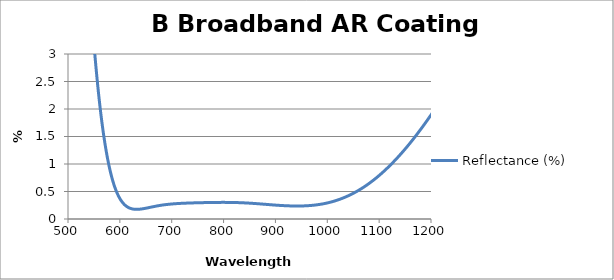
| Category | Reflectance (%) |
|---|---|
| 500.0 | 12.191 |
| 501.0 | 11.975 |
| 502.0 | 11.758 |
| 503.0 | 11.541 |
| 504.0 | 11.323 |
| 505.0 | 11.106 |
| 506.0 | 10.888 |
| 507.0 | 10.671 |
| 508.0 | 10.454 |
| 509.0 | 10.238 |
| 510.0 | 10.023 |
| 511.0 | 9.809 |
| 512.0 | 9.596 |
| 513.0 | 9.384 |
| 514.0 | 9.174 |
| 515.0 | 8.965 |
| 516.0 | 8.758 |
| 517.0 | 8.552 |
| 518.0 | 8.349 |
| 519.0 | 8.147 |
| 520.0 | 7.947 |
| 521.0 | 7.749 |
| 522.0 | 7.553 |
| 523.0 | 7.36 |
| 524.0 | 7.169 |
| 525.0 | 6.98 |
| 526.0 | 6.794 |
| 527.0 | 6.611 |
| 528.0 | 6.43 |
| 529.0 | 6.252 |
| 530.0 | 6.077 |
| 531.0 | 5.904 |
| 532.0 | 5.735 |
| 533.0 | 5.568 |
| 534.0 | 5.403 |
| 535.0 | 5.242 |
| 536.0 | 5.084 |
| 537.0 | 4.928 |
| 538.0 | 4.776 |
| 539.0 | 4.628 |
| 540.0 | 4.482 |
| 541.0 | 4.339 |
| 542.0 | 4.199 |
| 543.0 | 4.062 |
| 544.0 | 3.928 |
| 545.0 | 3.797 |
| 546.0 | 3.669 |
| 547.0 | 3.544 |
| 548.0 | 3.422 |
| 549.0 | 3.303 |
| 550.0 | 3.187 |
| 551.0 | 3.074 |
| 552.0 | 2.964 |
| 553.0 | 2.858 |
| 554.0 | 2.753 |
| 555.0 | 2.652 |
| 556.0 | 2.554 |
| 557.0 | 2.458 |
| 558.0 | 2.365 |
| 559.0 | 2.274 |
| 560.0 | 2.187 |
| 561.0 | 2.102 |
| 562.0 | 2.019 |
| 563.0 | 1.939 |
| 564.0 | 1.862 |
| 565.0 | 1.787 |
| 566.0 | 1.715 |
| 567.0 | 1.645 |
| 568.0 | 1.577 |
| 569.0 | 1.512 |
| 570.0 | 1.448 |
| 571.0 | 1.387 |
| 572.0 | 1.328 |
| 573.0 | 1.272 |
| 574.0 | 1.217 |
| 575.0 | 1.164 |
| 576.0 | 1.114 |
| 577.0 | 1.065 |
| 578.0 | 1.018 |
| 579.0 | 0.973 |
| 580.0 | 0.93 |
| 581.0 | 0.888 |
| 582.0 | 0.849 |
| 583.0 | 0.81 |
| 584.0 | 0.774 |
| 585.0 | 0.739 |
| 586.0 | 0.705 |
| 587.0 | 0.673 |
| 588.0 | 0.643 |
| 589.0 | 0.614 |
| 590.0 | 0.586 |
| 591.0 | 0.559 |
| 592.0 | 0.534 |
| 593.0 | 0.51 |
| 594.0 | 0.487 |
| 595.0 | 0.465 |
| 596.0 | 0.444 |
| 597.0 | 0.425 |
| 598.0 | 0.406 |
| 599.0 | 0.389 |
| 600.0 | 0.372 |
| 601.0 | 0.356 |
| 602.0 | 0.342 |
| 603.0 | 0.328 |
| 604.0 | 0.315 |
| 605.0 | 0.302 |
| 606.0 | 0.291 |
| 607.0 | 0.28 |
| 608.0 | 0.27 |
| 609.0 | 0.261 |
| 610.0 | 0.252 |
| 611.0 | 0.244 |
| 612.0 | 0.236 |
| 613.0 | 0.229 |
| 614.0 | 0.223 |
| 615.0 | 0.217 |
| 616.0 | 0.211 |
| 617.0 | 0.206 |
| 618.0 | 0.202 |
| 619.0 | 0.198 |
| 620.0 | 0.194 |
| 621.0 | 0.191 |
| 622.0 | 0.188 |
| 623.0 | 0.186 |
| 624.0 | 0.183 |
| 625.0 | 0.182 |
| 626.0 | 0.18 |
| 627.0 | 0.179 |
| 628.0 | 0.178 |
| 629.0 | 0.177 |
| 630.0 | 0.176 |
| 631.0 | 0.176 |
| 632.0 | 0.176 |
| 633.0 | 0.176 |
| 634.0 | 0.176 |
| 635.0 | 0.176 |
| 636.0 | 0.177 |
| 637.0 | 0.178 |
| 638.0 | 0.178 |
| 639.0 | 0.179 |
| 640.0 | 0.18 |
| 641.0 | 0.182 |
| 642.0 | 0.183 |
| 643.0 | 0.184 |
| 644.0 | 0.186 |
| 645.0 | 0.187 |
| 646.0 | 0.189 |
| 647.0 | 0.19 |
| 648.0 | 0.192 |
| 649.0 | 0.194 |
| 650.0 | 0.196 |
| 651.0 | 0.198 |
| 652.0 | 0.2 |
| 653.0 | 0.202 |
| 654.0 | 0.203 |
| 655.0 | 0.205 |
| 656.0 | 0.207 |
| 657.0 | 0.209 |
| 658.0 | 0.211 |
| 659.0 | 0.213 |
| 660.0 | 0.215 |
| 661.0 | 0.217 |
| 662.0 | 0.219 |
| 663.0 | 0.221 |
| 664.0 | 0.223 |
| 665.0 | 0.225 |
| 666.0 | 0.227 |
| 667.0 | 0.229 |
| 668.0 | 0.231 |
| 669.0 | 0.232 |
| 670.0 | 0.234 |
| 671.0 | 0.236 |
| 672.0 | 0.238 |
| 673.0 | 0.24 |
| 674.0 | 0.241 |
| 675.0 | 0.243 |
| 676.0 | 0.244 |
| 677.0 | 0.246 |
| 678.0 | 0.248 |
| 679.0 | 0.249 |
| 680.0 | 0.25 |
| 681.0 | 0.252 |
| 682.0 | 0.253 |
| 683.0 | 0.255 |
| 684.0 | 0.256 |
| 685.0 | 0.257 |
| 686.0 | 0.258 |
| 687.0 | 0.26 |
| 688.0 | 0.261 |
| 689.0 | 0.262 |
| 690.0 | 0.263 |
| 691.0 | 0.264 |
| 692.0 | 0.265 |
| 693.0 | 0.266 |
| 694.0 | 0.267 |
| 695.0 | 0.268 |
| 696.0 | 0.269 |
| 697.0 | 0.27 |
| 698.0 | 0.271 |
| 699.0 | 0.272 |
| 700.0 | 0.273 |
| 701.0 | 0.274 |
| 702.0 | 0.274 |
| 703.0 | 0.275 |
| 704.0 | 0.276 |
| 705.0 | 0.277 |
| 706.0 | 0.277 |
| 707.0 | 0.278 |
| 708.0 | 0.279 |
| 709.0 | 0.279 |
| 710.0 | 0.28 |
| 711.0 | 0.281 |
| 712.0 | 0.281 |
| 713.0 | 0.282 |
| 714.0 | 0.282 |
| 715.0 | 0.283 |
| 716.0 | 0.283 |
| 717.0 | 0.284 |
| 718.0 | 0.284 |
| 719.0 | 0.285 |
| 720.0 | 0.285 |
| 721.0 | 0.286 |
| 722.0 | 0.286 |
| 723.0 | 0.286 |
| 724.0 | 0.287 |
| 725.0 | 0.287 |
| 726.0 | 0.288 |
| 727.0 | 0.288 |
| 728.0 | 0.288 |
| 729.0 | 0.289 |
| 730.0 | 0.289 |
| 731.0 | 0.29 |
| 732.0 | 0.29 |
| 733.0 | 0.29 |
| 734.0 | 0.291 |
| 735.0 | 0.291 |
| 736.0 | 0.291 |
| 737.0 | 0.292 |
| 738.0 | 0.292 |
| 739.0 | 0.292 |
| 740.0 | 0.292 |
| 741.0 | 0.293 |
| 742.0 | 0.293 |
| 743.0 | 0.293 |
| 744.0 | 0.294 |
| 745.0 | 0.294 |
| 746.0 | 0.294 |
| 747.0 | 0.294 |
| 748.0 | 0.295 |
| 749.0 | 0.295 |
| 750.0 | 0.295 |
| 751.0 | 0.296 |
| 752.0 | 0.296 |
| 753.0 | 0.296 |
| 754.0 | 0.296 |
| 755.0 | 0.296 |
| 756.0 | 0.297 |
| 757.0 | 0.297 |
| 758.0 | 0.297 |
| 759.0 | 0.297 |
| 760.0 | 0.297 |
| 761.0 | 0.298 |
| 762.0 | 0.298 |
| 763.0 | 0.298 |
| 764.0 | 0.298 |
| 765.0 | 0.298 |
| 766.0 | 0.299 |
| 767.0 | 0.299 |
| 768.0 | 0.299 |
| 769.0 | 0.299 |
| 770.0 | 0.299 |
| 771.0 | 0.3 |
| 772.0 | 0.3 |
| 773.0 | 0.3 |
| 774.0 | 0.3 |
| 775.0 | 0.3 |
| 776.0 | 0.3 |
| 777.0 | 0.3 |
| 778.0 | 0.301 |
| 779.0 | 0.301 |
| 780.0 | 0.301 |
| 781.0 | 0.301 |
| 782.0 | 0.301 |
| 783.0 | 0.301 |
| 784.0 | 0.301 |
| 785.0 | 0.302 |
| 786.0 | 0.302 |
| 787.0 | 0.302 |
| 788.0 | 0.302 |
| 789.0 | 0.302 |
| 790.0 | 0.302 |
| 791.0 | 0.302 |
| 792.0 | 0.302 |
| 793.0 | 0.302 |
| 794.0 | 0.302 |
| 795.0 | 0.302 |
| 796.0 | 0.302 |
| 797.0 | 0.302 |
| 798.0 | 0.302 |
| 799.0 | 0.302 |
| 800.0 | 0.302 |
| 801.0 | 0.302 |
| 802.0 | 0.302 |
| 803.0 | 0.302 |
| 804.0 | 0.302 |
| 805.0 | 0.302 |
| 806.0 | 0.302 |
| 807.0 | 0.302 |
| 808.0 | 0.302 |
| 809.0 | 0.302 |
| 810.0 | 0.302 |
| 811.0 | 0.302 |
| 812.0 | 0.302 |
| 813.0 | 0.301 |
| 814.0 | 0.301 |
| 815.0 | 0.301 |
| 816.0 | 0.301 |
| 817.0 | 0.301 |
| 818.0 | 0.3 |
| 819.0 | 0.3 |
| 820.0 | 0.3 |
| 821.0 | 0.3 |
| 822.0 | 0.3 |
| 823.0 | 0.299 |
| 824.0 | 0.299 |
| 825.0 | 0.299 |
| 826.0 | 0.298 |
| 827.0 | 0.298 |
| 828.0 | 0.298 |
| 829.0 | 0.298 |
| 830.0 | 0.297 |
| 831.0 | 0.297 |
| 832.0 | 0.296 |
| 833.0 | 0.296 |
| 834.0 | 0.296 |
| 835.0 | 0.295 |
| 836.0 | 0.295 |
| 837.0 | 0.295 |
| 838.0 | 0.294 |
| 839.0 | 0.294 |
| 840.0 | 0.293 |
| 841.0 | 0.293 |
| 842.0 | 0.292 |
| 843.0 | 0.292 |
| 844.0 | 0.291 |
| 845.0 | 0.291 |
| 846.0 | 0.29 |
| 847.0 | 0.29 |
| 848.0 | 0.289 |
| 849.0 | 0.289 |
| 850.0 | 0.288 |
| 851.0 | 0.288 |
| 852.0 | 0.287 |
| 853.0 | 0.286 |
| 854.0 | 0.286 |
| 855.0 | 0.285 |
| 856.0 | 0.284 |
| 857.0 | 0.284 |
| 858.0 | 0.283 |
| 859.0 | 0.282 |
| 860.0 | 0.282 |
| 861.0 | 0.281 |
| 862.0 | 0.28 |
| 863.0 | 0.28 |
| 864.0 | 0.279 |
| 865.0 | 0.278 |
| 866.0 | 0.278 |
| 867.0 | 0.277 |
| 868.0 | 0.276 |
| 869.0 | 0.276 |
| 870.0 | 0.275 |
| 871.0 | 0.274 |
| 872.0 | 0.273 |
| 873.0 | 0.273 |
| 874.0 | 0.272 |
| 875.0 | 0.271 |
| 876.0 | 0.27 |
| 877.0 | 0.27 |
| 878.0 | 0.269 |
| 879.0 | 0.268 |
| 880.0 | 0.267 |
| 881.0 | 0.267 |
| 882.0 | 0.266 |
| 883.0 | 0.265 |
| 884.0 | 0.264 |
| 885.0 | 0.264 |
| 886.0 | 0.263 |
| 887.0 | 0.262 |
| 888.0 | 0.261 |
| 889.0 | 0.261 |
| 890.0 | 0.26 |
| 891.0 | 0.259 |
| 892.0 | 0.258 |
| 893.0 | 0.258 |
| 894.0 | 0.257 |
| 895.0 | 0.256 |
| 896.0 | 0.255 |
| 897.0 | 0.255 |
| 898.0 | 0.254 |
| 899.0 | 0.253 |
| 900.0 | 0.252 |
| 901.0 | 0.252 |
| 902.0 | 0.251 |
| 903.0 | 0.25 |
| 904.0 | 0.25 |
| 905.0 | 0.249 |
| 906.0 | 0.249 |
| 907.0 | 0.248 |
| 908.0 | 0.248 |
| 909.0 | 0.247 |
| 910.0 | 0.246 |
| 911.0 | 0.246 |
| 912.0 | 0.245 |
| 913.0 | 0.245 |
| 914.0 | 0.244 |
| 915.0 | 0.244 |
| 916.0 | 0.243 |
| 917.0 | 0.243 |
| 918.0 | 0.242 |
| 919.0 | 0.242 |
| 920.0 | 0.241 |
| 921.0 | 0.241 |
| 922.0 | 0.24 |
| 923.0 | 0.24 |
| 924.0 | 0.24 |
| 925.0 | 0.239 |
| 926.0 | 0.239 |
| 927.0 | 0.239 |
| 928.0 | 0.238 |
| 929.0 | 0.238 |
| 930.0 | 0.238 |
| 931.0 | 0.238 |
| 932.0 | 0.237 |
| 933.0 | 0.237 |
| 934.0 | 0.237 |
| 935.0 | 0.237 |
| 936.0 | 0.237 |
| 937.0 | 0.236 |
| 938.0 | 0.236 |
| 939.0 | 0.236 |
| 940.0 | 0.236 |
| 941.0 | 0.236 |
| 942.0 | 0.236 |
| 943.0 | 0.236 |
| 944.0 | 0.236 |
| 945.0 | 0.236 |
| 946.0 | 0.236 |
| 947.0 | 0.236 |
| 948.0 | 0.237 |
| 949.0 | 0.237 |
| 950.0 | 0.237 |
| 951.0 | 0.237 |
| 952.0 | 0.238 |
| 953.0 | 0.238 |
| 954.0 | 0.238 |
| 955.0 | 0.238 |
| 956.0 | 0.239 |
| 957.0 | 0.239 |
| 958.0 | 0.24 |
| 959.0 | 0.24 |
| 960.0 | 0.241 |
| 961.0 | 0.241 |
| 962.0 | 0.242 |
| 963.0 | 0.242 |
| 964.0 | 0.243 |
| 965.0 | 0.244 |
| 966.0 | 0.244 |
| 967.0 | 0.245 |
| 968.0 | 0.246 |
| 969.0 | 0.247 |
| 970.0 | 0.248 |
| 971.0 | 0.248 |
| 972.0 | 0.249 |
| 973.0 | 0.25 |
| 974.0 | 0.251 |
| 975.0 | 0.252 |
| 976.0 | 0.253 |
| 977.0 | 0.254 |
| 978.0 | 0.256 |
| 979.0 | 0.257 |
| 980.0 | 0.258 |
| 981.0 | 0.259 |
| 982.0 | 0.261 |
| 983.0 | 0.262 |
| 984.0 | 0.263 |
| 985.0 | 0.265 |
| 986.0 | 0.266 |
| 987.0 | 0.268 |
| 988.0 | 0.269 |
| 989.0 | 0.271 |
| 990.0 | 0.273 |
| 991.0 | 0.274 |
| 992.0 | 0.276 |
| 993.0 | 0.278 |
| 994.0 | 0.28 |
| 995.0 | 0.282 |
| 996.0 | 0.284 |
| 997.0 | 0.286 |
| 998.0 | 0.288 |
| 999.0 | 0.29 |
| 1000.0 | 0.292 |
| 1001.0 | 0.294 |
| 1002.0 | 0.296 |
| 1003.0 | 0.299 |
| 1004.0 | 0.301 |
| 1005.0 | 0.303 |
| 1006.0 | 0.306 |
| 1007.0 | 0.308 |
| 1008.0 | 0.311 |
| 1009.0 | 0.313 |
| 1010.0 | 0.316 |
| 1011.0 | 0.319 |
| 1012.0 | 0.321 |
| 1013.0 | 0.324 |
| 1014.0 | 0.327 |
| 1015.0 | 0.33 |
| 1016.0 | 0.333 |
| 1017.0 | 0.336 |
| 1018.0 | 0.339 |
| 1019.0 | 0.342 |
| 1020.0 | 0.345 |
| 1021.0 | 0.348 |
| 1022.0 | 0.352 |
| 1023.0 | 0.355 |
| 1024.0 | 0.358 |
| 1025.0 | 0.362 |
| 1026.0 | 0.365 |
| 1027.0 | 0.369 |
| 1028.0 | 0.372 |
| 1029.0 | 0.376 |
| 1030.0 | 0.38 |
| 1031.0 | 0.384 |
| 1032.0 | 0.388 |
| 1033.0 | 0.391 |
| 1034.0 | 0.395 |
| 1035.0 | 0.399 |
| 1036.0 | 0.404 |
| 1037.0 | 0.408 |
| 1038.0 | 0.412 |
| 1039.0 | 0.416 |
| 1040.0 | 0.42 |
| 1041.0 | 0.425 |
| 1042.0 | 0.429 |
| 1043.0 | 0.434 |
| 1044.0 | 0.438 |
| 1045.0 | 0.443 |
| 1046.0 | 0.447 |
| 1047.0 | 0.452 |
| 1048.0 | 0.457 |
| 1049.0 | 0.462 |
| 1050.0 | 0.467 |
| 1051.0 | 0.472 |
| 1052.0 | 0.477 |
| 1053.0 | 0.482 |
| 1054.0 | 0.487 |
| 1055.0 | 0.492 |
| 1056.0 | 0.497 |
| 1057.0 | 0.503 |
| 1058.0 | 0.508 |
| 1059.0 | 0.514 |
| 1060.0 | 0.519 |
| 1061.0 | 0.525 |
| 1062.0 | 0.53 |
| 1063.0 | 0.536 |
| 1064.0 | 0.542 |
| 1065.0 | 0.548 |
| 1066.0 | 0.553 |
| 1067.0 | 0.559 |
| 1068.0 | 0.565 |
| 1069.0 | 0.572 |
| 1070.0 | 0.578 |
| 1071.0 | 0.584 |
| 1072.0 | 0.59 |
| 1073.0 | 0.596 |
| 1074.0 | 0.603 |
| 1075.0 | 0.609 |
| 1076.0 | 0.616 |
| 1077.0 | 0.622 |
| 1078.0 | 0.629 |
| 1079.0 | 0.636 |
| 1080.0 | 0.642 |
| 1081.0 | 0.649 |
| 1082.0 | 0.656 |
| 1083.0 | 0.663 |
| 1084.0 | 0.67 |
| 1085.0 | 0.677 |
| 1086.0 | 0.684 |
| 1087.0 | 0.692 |
| 1088.0 | 0.699 |
| 1089.0 | 0.706 |
| 1090.0 | 0.714 |
| 1091.0 | 0.721 |
| 1092.0 | 0.729 |
| 1093.0 | 0.736 |
| 1094.0 | 0.744 |
| 1095.0 | 0.752 |
| 1096.0 | 0.759 |
| 1097.0 | 0.767 |
| 1098.0 | 0.775 |
| 1099.0 | 0.783 |
| 1100.0 | 0.791 |
| 1101.0 | 0.799 |
| 1102.0 | 0.807 |
| 1103.0 | 0.816 |
| 1104.0 | 0.824 |
| 1105.0 | 0.832 |
| 1106.0 | 0.841 |
| 1107.0 | 0.849 |
| 1108.0 | 0.858 |
| 1109.0 | 0.866 |
| 1110.0 | 0.875 |
| 1111.0 | 0.884 |
| 1112.0 | 0.892 |
| 1113.0 | 0.901 |
| 1114.0 | 0.91 |
| 1115.0 | 0.919 |
| 1116.0 | 0.928 |
| 1117.0 | 0.937 |
| 1118.0 | 0.946 |
| 1119.0 | 0.956 |
| 1120.0 | 0.965 |
| 1121.0 | 0.974 |
| 1122.0 | 0.984 |
| 1123.0 | 0.993 |
| 1124.0 | 1.003 |
| 1125.0 | 1.012 |
| 1126.0 | 1.022 |
| 1127.0 | 1.032 |
| 1128.0 | 1.041 |
| 1129.0 | 1.051 |
| 1130.0 | 1.061 |
| 1131.0 | 1.071 |
| 1132.0 | 1.081 |
| 1133.0 | 1.091 |
| 1134.0 | 1.101 |
| 1135.0 | 1.111 |
| 1136.0 | 1.122 |
| 1137.0 | 1.132 |
| 1138.0 | 1.142 |
| 1139.0 | 1.153 |
| 1140.0 | 1.163 |
| 1141.0 | 1.174 |
| 1142.0 | 1.184 |
| 1143.0 | 1.195 |
| 1144.0 | 1.206 |
| 1145.0 | 1.216 |
| 1146.0 | 1.227 |
| 1147.0 | 1.238 |
| 1148.0 | 1.249 |
| 1149.0 | 1.26 |
| 1150.0 | 1.271 |
| 1151.0 | 1.282 |
| 1152.0 | 1.294 |
| 1153.0 | 1.305 |
| 1154.0 | 1.316 |
| 1155.0 | 1.327 |
| 1156.0 | 1.339 |
| 1157.0 | 1.35 |
| 1158.0 | 1.362 |
| 1159.0 | 1.373 |
| 1160.0 | 1.385 |
| 1161.0 | 1.397 |
| 1162.0 | 1.408 |
| 1163.0 | 1.42 |
| 1164.0 | 1.432 |
| 1165.0 | 1.444 |
| 1166.0 | 1.456 |
| 1167.0 | 1.468 |
| 1168.0 | 1.48 |
| 1169.0 | 1.492 |
| 1170.0 | 1.504 |
| 1171.0 | 1.516 |
| 1172.0 | 1.529 |
| 1173.0 | 1.541 |
| 1174.0 | 1.553 |
| 1175.0 | 1.566 |
| 1176.0 | 1.578 |
| 1177.0 | 1.591 |
| 1178.0 | 1.603 |
| 1179.0 | 1.616 |
| 1180.0 | 1.628 |
| 1181.0 | 1.641 |
| 1182.0 | 1.654 |
| 1183.0 | 1.667 |
| 1184.0 | 1.68 |
| 1185.0 | 1.693 |
| 1186.0 | 1.706 |
| 1187.0 | 1.719 |
| 1188.0 | 1.732 |
| 1189.0 | 1.745 |
| 1190.0 | 1.758 |
| 1191.0 | 1.771 |
| 1192.0 | 1.784 |
| 1193.0 | 1.798 |
| 1194.0 | 1.811 |
| 1195.0 | 1.825 |
| 1196.0 | 1.838 |
| 1197.0 | 1.852 |
| 1198.0 | 1.865 |
| 1199.0 | 1.879 |
| 1200.0 | 1.892 |
| 1201.0 | 1.906 |
| 1202.0 | 1.92 |
| 1203.0 | 1.933 |
| 1204.0 | 1.947 |
| 1205.0 | 1.961 |
| 1206.0 | 1.975 |
| 1207.0 | 1.989 |
| 1208.0 | 2.003 |
| 1209.0 | 2.017 |
| 1210.0 | 2.031 |
| 1211.0 | 2.045 |
| 1212.0 | 2.059 |
| 1213.0 | 2.074 |
| 1214.0 | 2.088 |
| 1215.0 | 2.102 |
| 1216.0 | 2.116 |
| 1217.0 | 2.131 |
| 1218.0 | 2.145 |
| 1219.0 | 2.16 |
| 1220.0 | 2.174 |
| 1221.0 | 2.189 |
| 1222.0 | 2.203 |
| 1223.0 | 2.218 |
| 1224.0 | 2.232 |
| 1225.0 | 2.247 |
| 1226.0 | 2.262 |
| 1227.0 | 2.277 |
| 1228.0 | 2.292 |
| 1229.0 | 2.306 |
| 1230.0 | 2.321 |
| 1231.0 | 2.336 |
| 1232.0 | 2.351 |
| 1233.0 | 2.366 |
| 1234.0 | 2.381 |
| 1235.0 | 2.396 |
| 1236.0 | 2.411 |
| 1237.0 | 2.426 |
| 1238.0 | 2.442 |
| 1239.0 | 2.457 |
| 1240.0 | 2.472 |
| 1241.0 | 2.487 |
| 1242.0 | 2.503 |
| 1243.0 | 2.518 |
| 1244.0 | 2.533 |
| 1245.0 | 2.549 |
| 1246.0 | 2.564 |
| 1247.0 | 2.58 |
| 1248.0 | 2.595 |
| 1249.0 | 2.611 |
| 1250.0 | 2.626 |
| 1251.0 | 2.642 |
| 1252.0 | 2.658 |
| 1253.0 | 2.673 |
| 1254.0 | 2.689 |
| 1255.0 | 2.705 |
| 1256.0 | 2.72 |
| 1257.0 | 2.736 |
| 1258.0 | 2.752 |
| 1259.0 | 2.768 |
| 1260.0 | 2.784 |
| 1261.0 | 2.8 |
| 1262.0 | 2.816 |
| 1263.0 | 2.832 |
| 1264.0 | 2.848 |
| 1265.0 | 2.864 |
| 1266.0 | 2.88 |
| 1267.0 | 2.896 |
| 1268.0 | 2.912 |
| 1269.0 | 2.928 |
| 1270.0 | 2.944 |
| 1271.0 | 2.96 |
| 1272.0 | 2.976 |
| 1273.0 | 2.993 |
| 1274.0 | 3.009 |
| 1275.0 | 3.025 |
| 1276.0 | 3.042 |
| 1277.0 | 3.058 |
| 1278.0 | 3.074 |
| 1279.0 | 3.091 |
| 1280.0 | 3.107 |
| 1281.0 | 3.123 |
| 1282.0 | 3.14 |
| 1283.0 | 3.156 |
| 1284.0 | 3.173 |
| 1285.0 | 3.189 |
| 1286.0 | 3.206 |
| 1287.0 | 3.222 |
| 1288.0 | 3.239 |
| 1289.0 | 3.256 |
| 1290.0 | 3.272 |
| 1291.0 | 3.289 |
| 1292.0 | 3.306 |
| 1293.0 | 3.322 |
| 1294.0 | 3.339 |
| 1295.0 | 3.356 |
| 1296.0 | 3.372 |
| 1297.0 | 3.389 |
| 1298.0 | 3.406 |
| 1299.0 | 3.423 |
| 1300.0 | 3.44 |
| 1301.0 | 3.456 |
| 1302.0 | 3.473 |
| 1303.0 | 3.49 |
| 1304.0 | 3.507 |
| 1305.0 | 3.524 |
| 1306.0 | 3.541 |
| 1307.0 | 3.558 |
| 1308.0 | 3.575 |
| 1309.0 | 3.592 |
| 1310.0 | 3.609 |
| 1311.0 | 3.626 |
| 1312.0 | 3.643 |
| 1313.0 | 3.66 |
| 1314.0 | 3.677 |
| 1315.0 | 3.694 |
| 1316.0 | 3.711 |
| 1317.0 | 3.728 |
| 1318.0 | 3.745 |
| 1319.0 | 3.762 |
| 1320.0 | 3.779 |
| 1321.0 | 3.797 |
| 1322.0 | 3.814 |
| 1323.0 | 3.831 |
| 1324.0 | 3.848 |
| 1325.0 | 3.865 |
| 1326.0 | 3.882 |
| 1327.0 | 3.9 |
| 1328.0 | 3.917 |
| 1329.0 | 3.934 |
| 1330.0 | 3.951 |
| 1331.0 | 3.969 |
| 1332.0 | 3.986 |
| 1333.0 | 4.003 |
| 1334.0 | 4.02 |
| 1335.0 | 4.038 |
| 1336.0 | 4.055 |
| 1337.0 | 4.072 |
| 1338.0 | 4.09 |
| 1339.0 | 4.107 |
| 1340.0 | 4.124 |
| 1341.0 | 4.142 |
| 1342.0 | 4.159 |
| 1343.0 | 4.176 |
| 1344.0 | 4.194 |
| 1345.0 | 4.211 |
| 1346.0 | 4.229 |
| 1347.0 | 4.246 |
| 1348.0 | 4.263 |
| 1349.0 | 4.281 |
| 1350.0 | 4.298 |
| 1351.0 | 4.316 |
| 1352.0 | 4.333 |
| 1353.0 | 4.35 |
| 1354.0 | 4.368 |
| 1355.0 | 4.385 |
| 1356.0 | 4.403 |
| 1357.0 | 4.42 |
| 1358.0 | 4.438 |
| 1359.0 | 4.455 |
| 1360.0 | 4.473 |
| 1361.0 | 4.49 |
| 1362.0 | 4.508 |
| 1363.0 | 4.525 |
| 1364.0 | 4.543 |
| 1365.0 | 4.56 |
| 1366.0 | 4.578 |
| 1367.0 | 4.595 |
| 1368.0 | 4.612 |
| 1369.0 | 4.63 |
| 1370.0 | 4.648 |
| 1371.0 | 4.665 |
| 1372.0 | 4.682 |
| 1373.0 | 4.7 |
| 1374.0 | 4.717 |
| 1375.0 | 4.735 |
| 1376.0 | 4.752 |
| 1377.0 | 4.77 |
| 1378.0 | 4.787 |
| 1379.0 | 4.805 |
| 1380.0 | 4.822 |
| 1381.0 | 4.84 |
| 1382.0 | 4.857 |
| 1383.0 | 4.875 |
| 1384.0 | 4.892 |
| 1385.0 | 4.91 |
| 1386.0 | 4.927 |
| 1387.0 | 4.945 |
| 1388.0 | 4.962 |
| 1389.0 | 4.98 |
| 1390.0 | 4.997 |
| 1391.0 | 5.015 |
| 1392.0 | 5.032 |
| 1393.0 | 5.05 |
| 1394.0 | 5.067 |
| 1395.0 | 5.085 |
| 1396.0 | 5.102 |
| 1397.0 | 5.12 |
| 1398.0 | 5.137 |
| 1399.0 | 5.154 |
| 1400.0 | 5.172 |